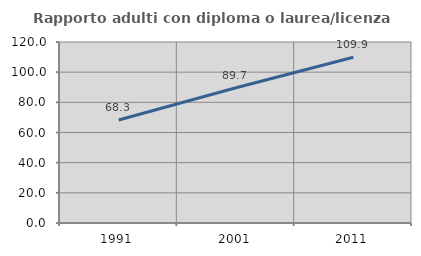
| Category | Rapporto adulti con diploma o laurea/licenza media  |
|---|---|
| 1991.0 | 68.287 |
| 2001.0 | 89.691 |
| 2011.0 | 109.916 |